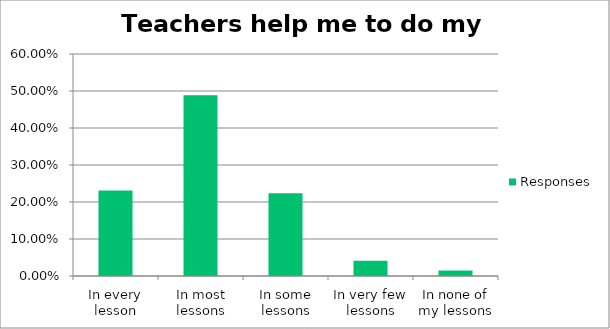
| Category | Responses |
|---|---|
| In every lesson | 0.231 |
| In most lessons | 0.489 |
| In some lessons | 0.224 |
| In very few lessons | 0.041 |
| In none of my lessons | 0.015 |